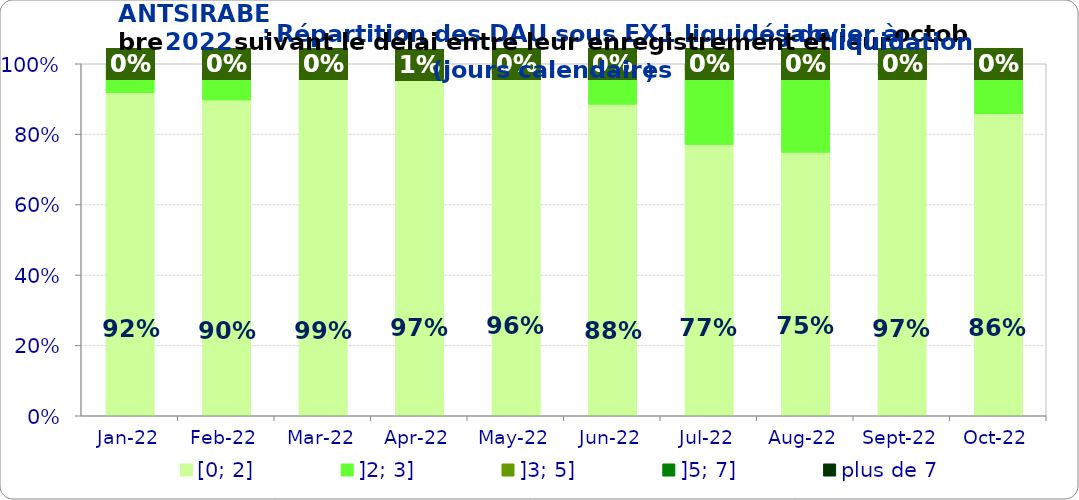
| Category | [0; 2] | ]2; 3] | ]3; 5] | ]5; 7] | plus de 7 |
|---|---|---|---|---|---|
| 2022-01-01 | 0.918 | 0.082 | 0 | 0 | 0 |
| 2022-02-01 | 0.897 | 0.103 | 0 | 0 | 0 |
| 2022-03-01 | 0.993 | 0.007 | 0 | 0 | 0 |
| 2022-04-01 | 0.97 | 0.006 | 0.006 | 0.012 | 0.006 |
| 2022-05-01 | 0.957 | 0.012 | 0.031 | 0 | 0 |
| 2022-06-01 | 0.885 | 0.11 | 0.005 | 0 | 0 |
| 2022-07-01 | 0.77 | 0.209 | 0.02 | 0 | 0 |
| 2022-08-01 | 0.748 | 0.209 | 0.043 | 0 | 0 |
| 2022-09-01 | 0.97 | 0.024 | 0 | 0.006 | 0 |
| 2022-10-01 | 0.858 | 0.137 | 0.005 | 0 | 0 |